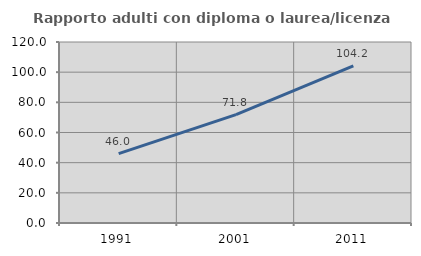
| Category | Rapporto adulti con diploma o laurea/licenza media  |
|---|---|
| 1991.0 | 46 |
| 2001.0 | 71.823 |
| 2011.0 | 104.211 |